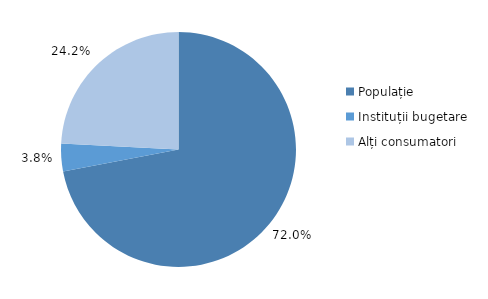
| Category | Series 0 |
|---|---|
| Populație | 0.72 |
| Instituții bugetare | 0.038 |
| Alți consumatori | 0.242 |